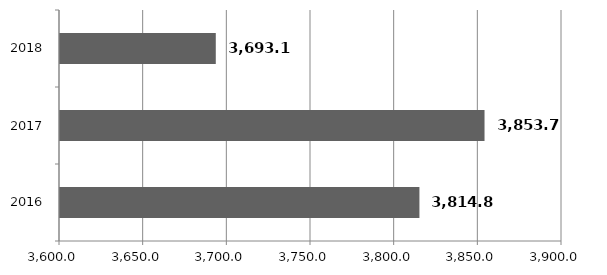
| Category | Series 0 |
|---|---|
| 2016.0 | 3814.8 |
| 2017.0 | 3853.7 |
| 2018.0 | 3693.1 |